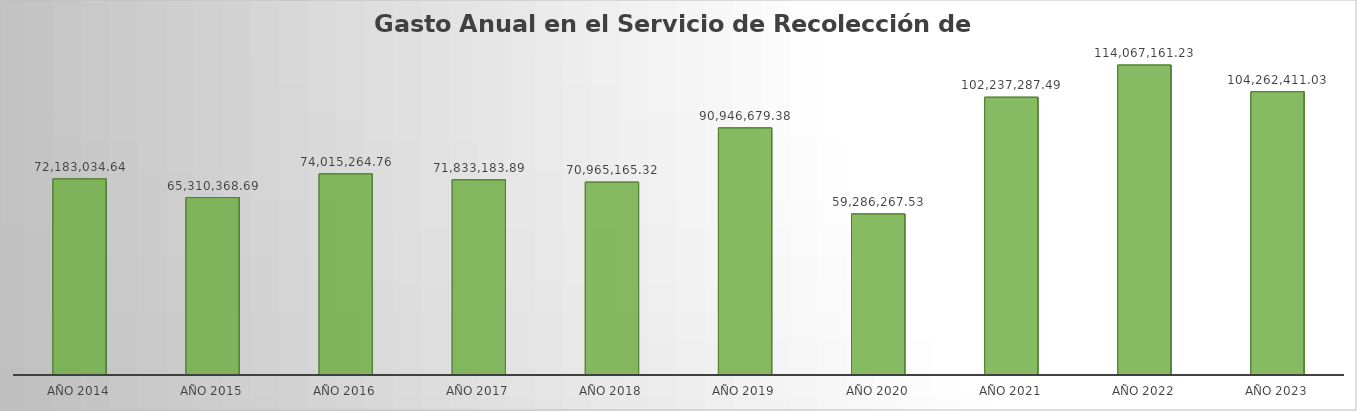
| Category | Monto |
|---|---|
| Año 2014 | 72183034.64 |
| Año 2015 | 65310368.69 |
| Año 2016 | 74015264.76 |
| Año 2017 | 71833183.89 |
| Año 2018 | 70965165.32 |
| Año 2019 | 90946679.38 |
| Año 2020 | 59286267.53 |
| Año 2021 | 102237287.49 |
| Año 2022 | 114067161.23 |
| Año 2023 | 104262411.03 |